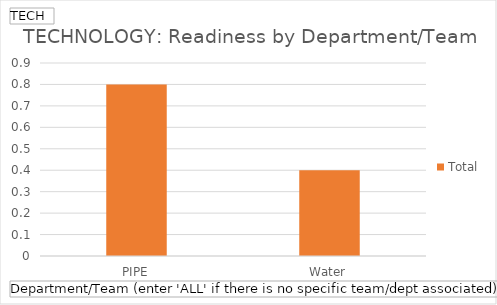
| Category | Total |
|---|---|
| PIPE | 0.8 |
| Water | 0.4 |